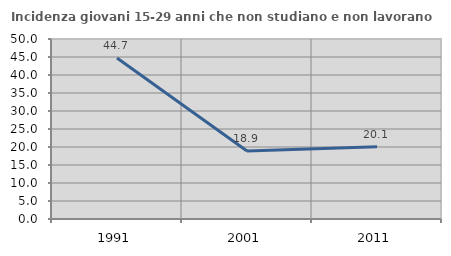
| Category | Incidenza giovani 15-29 anni che non studiano e non lavorano  |
|---|---|
| 1991.0 | 44.697 |
| 2001.0 | 18.904 |
| 2011.0 | 20.084 |